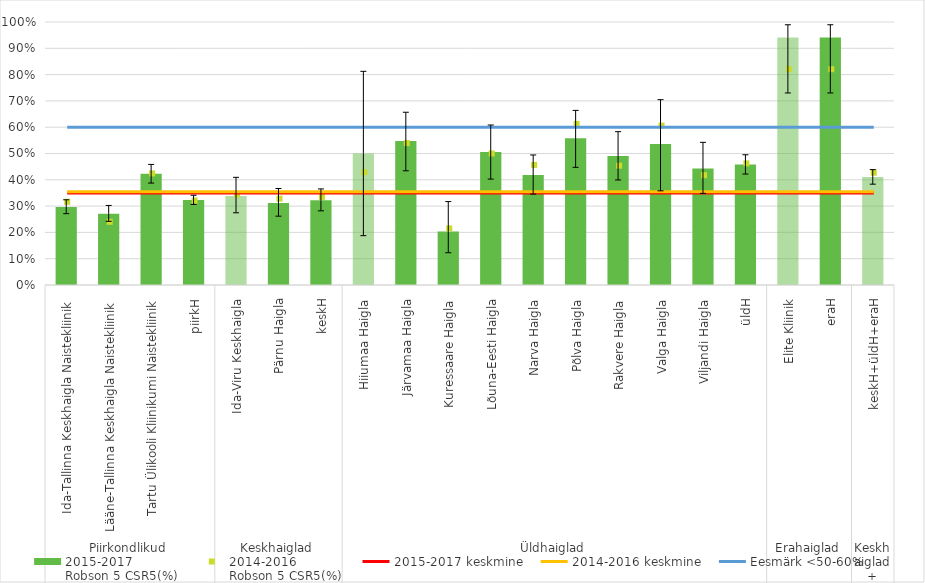
| Category | 2015-2017
Robson 5 CSR5(%) |
|---|---|
| 0 | 0.297 |
| 1 | 0.271 |
| 2 | 0.423 |
| 3 | 0.323 |
| 4 | 0.339 |
| 5 | 0.312 |
| 6 | 0.322 |
| 7 | 0.5 |
| 8 | 0.548 |
| 9 | 0.203 |
| 10 | 0.506 |
| 11 | 0.418 |
| 12 | 0.558 |
| 13 | 0.491 |
| 14 | 0.536 |
| 15 | 0.443 |
| 16 | 0.458 |
| 17 | 0.941 |
| 18 | 0.941 |
| 19 | 0.411 |